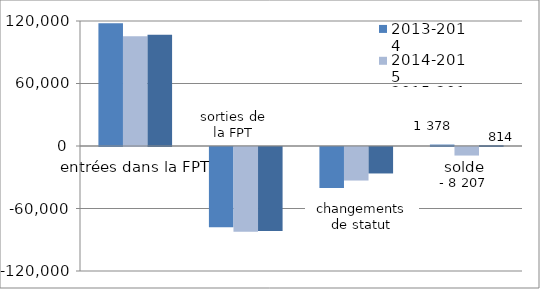
| Category | 2013-2014 | 2014-2015 | 2015-2016 |
|---|---|---|---|
| entrées dans la FPT | 117794 | 105471 | 106875 |
|  | -77044 | -81476 | -80653 |
|  | -39372 | -32202 | -25408 |
| solde | 1378 | -8207 | 814 |